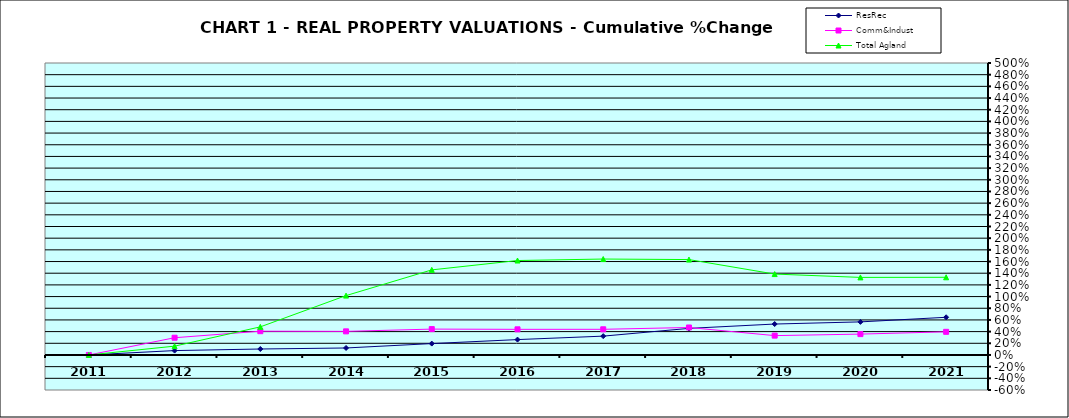
| Category | ResRec | Comm&Indust | Total Agland |
|---|---|---|---|
| 2011.0 | 0 | 0 | 0 |
| 2012.0 | 0.075 | 0.295 | 0.151 |
| 2013.0 | 0.102 | 0.407 | 0.481 |
| 2014.0 | 0.12 | 0.404 | 1.017 |
| 2015.0 | 0.195 | 0.443 | 1.457 |
| 2016.0 | 0.263 | 0.439 | 1.617 |
| 2017.0 | 0.323 | 0.439 | 1.643 |
| 2018.0 | 0.455 | 0.471 | 1.634 |
| 2019.0 | 0.53 | 0.331 | 1.385 |
| 2020.0 | 0.567 | 0.357 | 1.328 |
| 2021.0 | 0.645 | 0.396 | 1.33 |